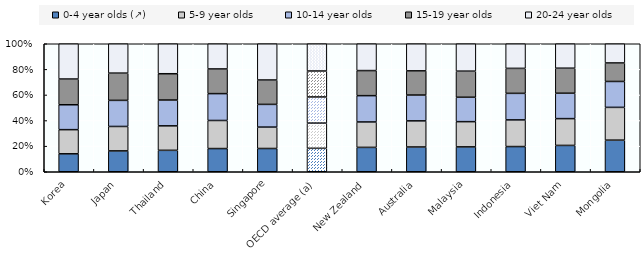
| Category | 0-4 year olds (↗) | 5-9 year olds | 10-14 year olds | 15-19 year olds | 20-24 year olds |
|---|---|---|---|---|---|
| Korea | 14.021 | 18.875 | 19.439 | 20.11 | 27.555 |
| Japan | 16.292 | 19.089 | 20.385 | 21.293 | 22.941 |
| Thailand | 16.738 | 19.124 | 20.177 | 20.537 | 23.425 |
| China | 18.123 | 21.932 | 20.992 | 19.266 | 19.686 |
| Singapore | 18.171 | 16.706 | 17.752 | 19.062 | 28.309 |
| OECD average (a) | 18.3 | 19.7 | 20.4 | 20.3 | 21.3 |
| New Zealand | 19.034 | 19.861 | 20.56 | 19.586 | 20.959 |
| Australia | 19.347 | 20.405 | 20.177 | 18.896 | 21.174 |
| Malaysia | 19.423 | 19.718 | 19.074 | 20.378 | 21.407 |
| Indonesia | 19.685 | 20.818 | 20.747 | 19.514 | 19.235 |
| Viet Nam | 20.575 | 20.934 | 19.853 | 19.54 | 19.098 |
| Mongolia | 24.687 | 25.612 | 20.239 | 14.464 | 14.998 |